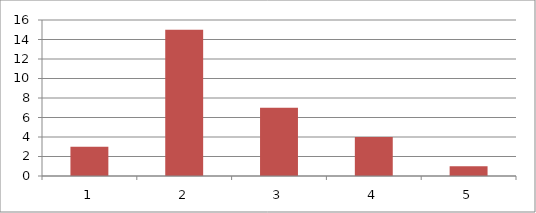
| Category | nj |
|---|---|
| 0 | 3 |
| 1 | 15 |
| 2 | 7 |
| 3 | 4 |
| 4 | 1 |